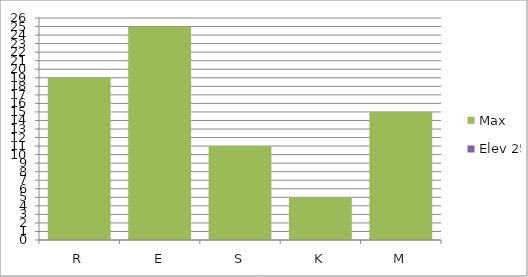
| Category | Max | Elev 25 |
|---|---|---|
| R | 19 | 0 |
| E | 25 | 0 |
| S | 11 | 0 |
| K | 5 | 0 |
| M | 15 | 0 |